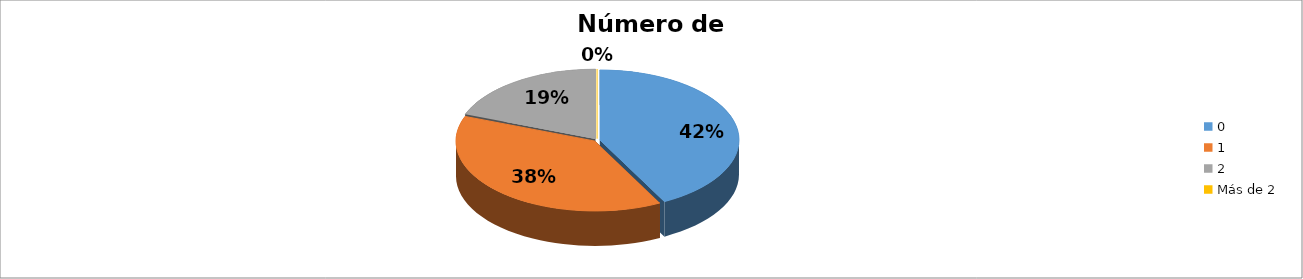
| Category | Series 0 |
|---|---|
| 0 | 0.423 |
| 1 | 0.385 |
| 2 | 0.192 |
| Más de 2 | 0 |